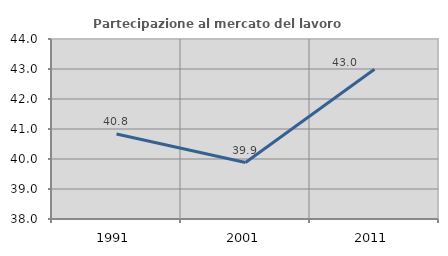
| Category | Partecipazione al mercato del lavoro  femminile |
|---|---|
| 1991.0 | 40.835 |
| 2001.0 | 39.88 |
| 2011.0 | 42.99 |